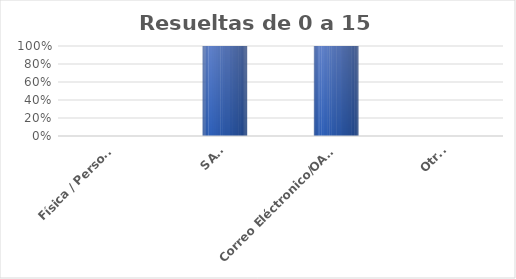
| Category | Series 0 |
|---|---|
| Física / Personal | 0 |
| SAIP | 4 |
| Correo Eléctronico/OAI/Info/Contacto | 10 |
| Otras | 0 |